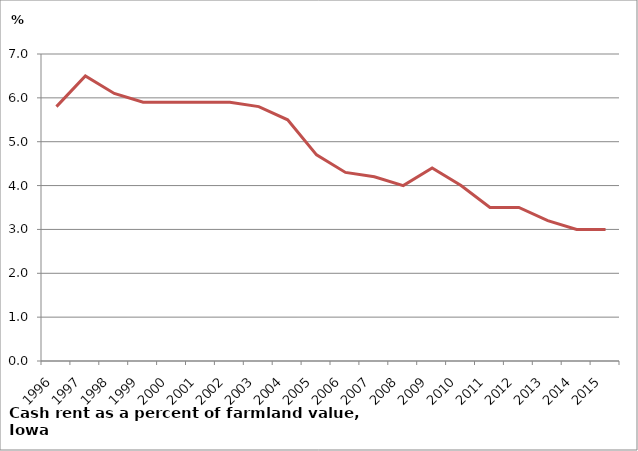
| Category | % |
|---|---|
| 1996.0 | 5.8 |
| 1997.0 | 6.5 |
| 1998.0 | 6.1 |
| 1999.0 | 5.9 |
| 2000.0 | 5.9 |
| 2001.0 | 5.9 |
| 2002.0 | 5.9 |
| 2003.0 | 5.8 |
| 2004.0 | 5.5 |
| 2005.0 | 4.7 |
| 2006.0 | 4.3 |
| 2007.0 | 4.2 |
| 2008.0 | 4 |
| 2009.0 | 4.4 |
| 2010.0 | 4 |
| 2011.0 | 3.5 |
| 2012.0 | 3.5 |
| 2013.0 | 3.2 |
| 2014.0 | 3 |
| 2015.0 | 3 |